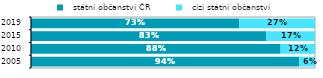
| Category |   státní občanství ČR |   cizí státní občanství |
|---|---|---|
| 2005.0 | 0.944 | 0.056 |
| 2010.0 | 0.879 | 0.121 |
| 2015.0 | 0.828 | 0.172 |
| 2019.0 | 0.733 | 0.267 |